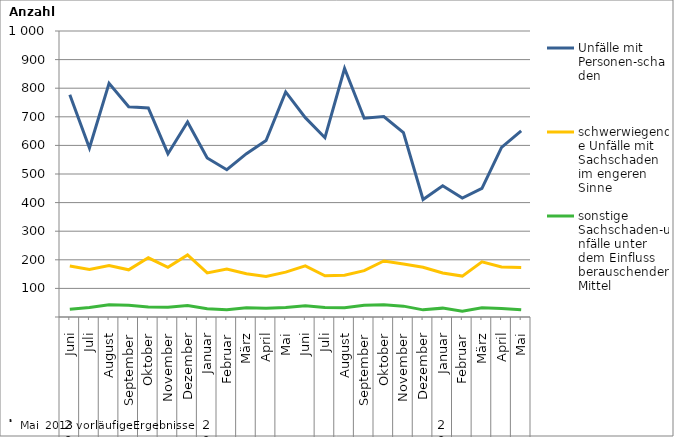
| Category | Unfälle mit Personen-schaden | schwerwiegende Unfälle mit Sachschaden   im engeren Sinne | sonstige Sachschaden-unfälle unter dem Einfluss berauschender Mittel |
|---|---|---|---|
| 0 | 777 | 178 | 27 |
| 1 | 591 | 166 | 33 |
| 2 | 817 | 180 | 43 |
| 3 | 735 | 165 | 41 |
| 4 | 731 | 207 | 35 |
| 5 | 571 | 174 | 34 |
| 6 | 682 | 217 | 40 |
| 7 | 556 | 154 | 29 |
| 8 | 515 | 168 | 25 |
| 9 | 571 | 151 | 32 |
| 10 | 617 | 142 | 31 |
| 11 | 787 | 157 | 33 |
| 12 | 697 | 179 | 39 |
| 13 | 627 | 144 | 33 |
| 14 | 869 | 146 | 32 |
| 15 | 695 | 162 | 41 |
| 16 | 701 | 196 | 43 |
| 17 | 645 | 185 | 38 |
| 18 | 411 | 174 | 25 |
| 19 | 459 | 154 | 31 |
| 20 | 416 | 143 | 20 |
| 21 | 450 | 193 | 32 |
| 22 | 593 | 175 | 30 |
| 23 | 651 | 173 | 25 |